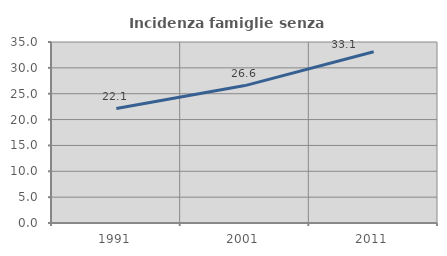
| Category | Incidenza famiglie senza nuclei |
|---|---|
| 1991.0 | 22.134 |
| 2001.0 | 26.569 |
| 2011.0 | 33.1 |